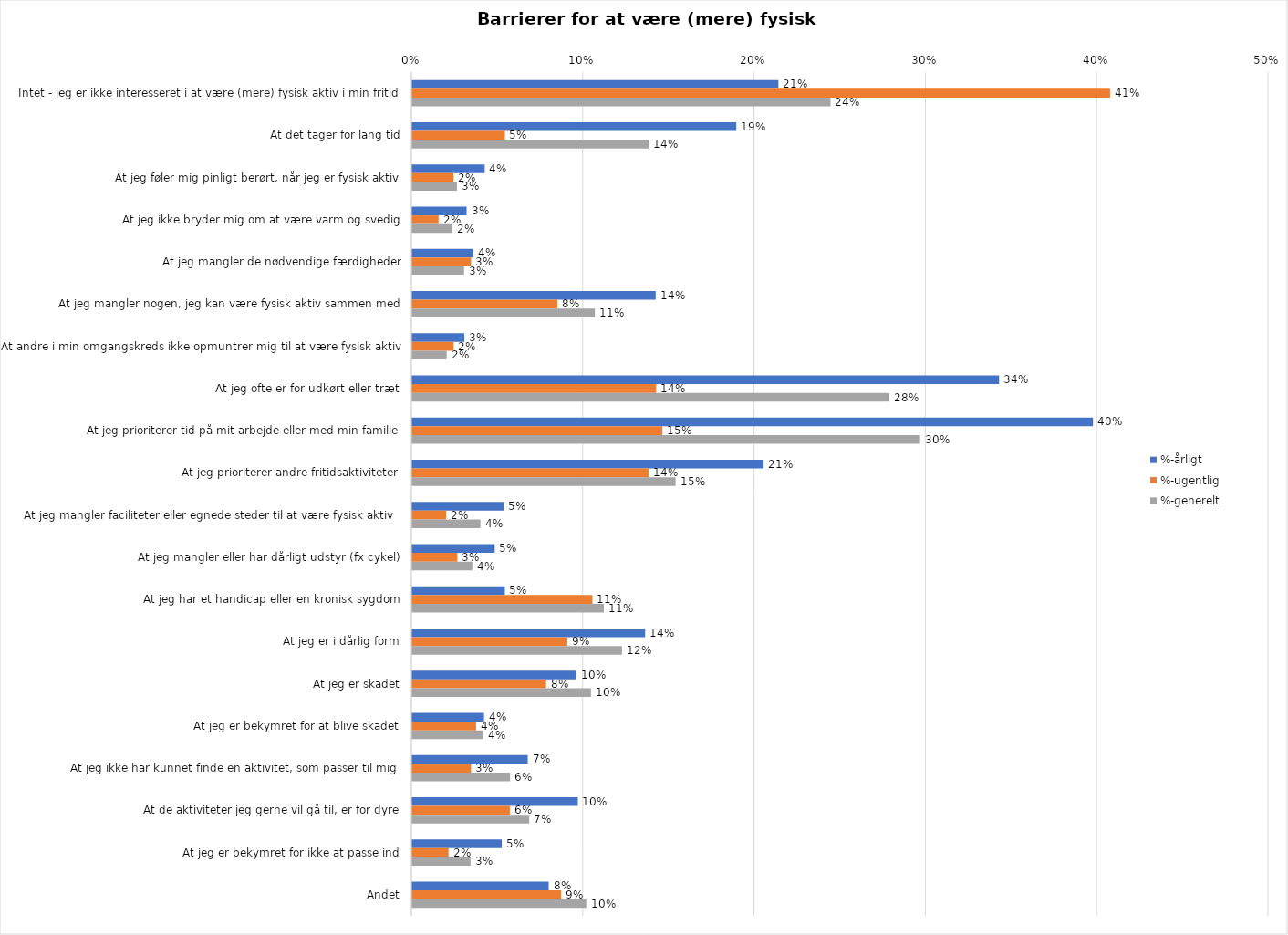
| Category | %-årligt | %-ugentlig | %-generelt |
|---|---|---|---|
| Intet - jeg er ikke interesseret i at være (mere) fysisk aktiv i min fritid | 0.214 | 0.407 | 0.244 |
| At det tager for lang tid | 0.189 | 0.054 | 0.138 |
| At jeg føler mig pinligt berørt, når jeg er fysisk aktiv | 0.042 | 0.024 | 0.026 |
| At jeg ikke bryder mig om at være varm og svedig | 0.032 | 0.015 | 0.023 |
| At jeg mangler de nødvendige færdigheder | 0.035 | 0.034 | 0.03 |
| At jeg mangler nogen, jeg kan være fysisk aktiv sammen med | 0.142 | 0.085 | 0.107 |
| At andre i min omgangskreds ikke opmuntrer mig til at være fysisk aktiv | 0.03 | 0.024 | 0.02 |
| At jeg ofte er for udkørt eller træt | 0.343 | 0.142 | 0.279 |
| At jeg prioriterer tid på mit arbejde eller med min familie | 0.397 | 0.146 | 0.296 |
| At jeg prioriterer andre fritidsaktiviteter | 0.205 | 0.138 | 0.154 |
| At jeg mangler faciliteter eller egnede steder til at være fysisk aktiv  | 0.053 | 0.02 | 0.04 |
| At jeg mangler eller har dårligt udstyr (fx cykel) | 0.048 | 0.026 | 0.035 |
| At jeg har et handicap eller en kronisk sygdom | 0.054 | 0.105 | 0.112 |
| At jeg er i dårlig form | 0.136 | 0.091 | 0.122 |
| At jeg er skadet | 0.096 | 0.078 | 0.104 |
| At jeg er bekymret for at blive skadet | 0.042 | 0.037 | 0.041 |
| At jeg ikke har kunnet finde en aktivitet, som passer til mig  | 0.067 | 0.034 | 0.057 |
| At de aktiviteter jeg gerne vil gå til, er for dyre | 0.097 | 0.057 | 0.068 |
| At jeg er bekymret for ikke at passe ind | 0.052 | 0.021 | 0.034 |
| Andet | 0.08 | 0.087 | 0.102 |